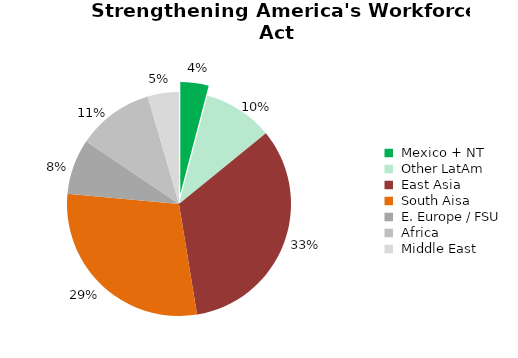
| Category | H1 Class Visas Issued |
|---|---|
|  Mexico + NT  | 20200 |
|  Other LatAm  | 49800 |
|  East Asia  | 164800 |
|  South Aisa  | 143800 |
|  E. Europe / FSU  | 39600 |
|  Africa  | 54600 |
|  Middle East  | 22300 |